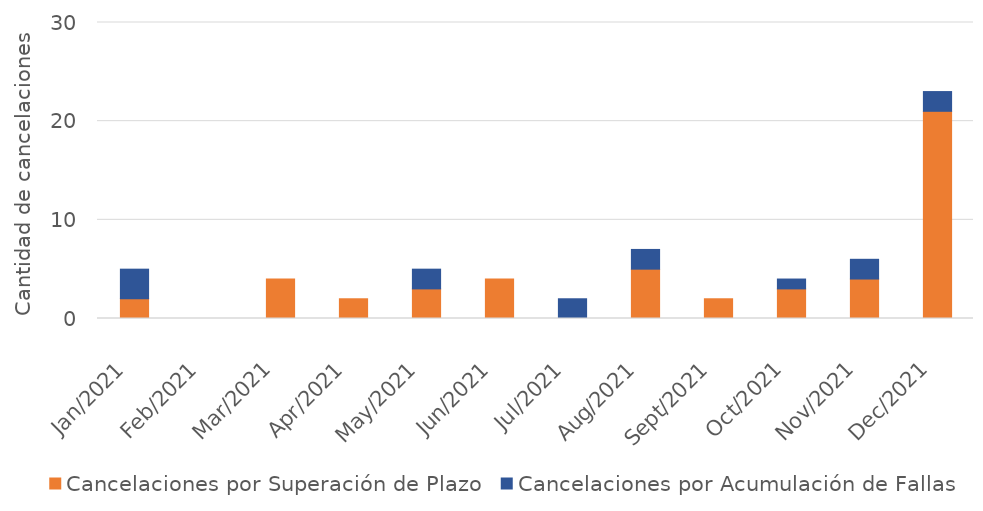
| Category | Cancelaciones por Superación de Plazo | Cancelaciones por Acumulación de Fallas |
|---|---|---|
| 2021-01-01 | 2 | 3 |
| 2021-02-01 | 0 | 0 |
| 2021-03-01 | 4 | 0 |
| 2021-04-01 | 2 | 0 |
| 2021-05-01 | 3 | 2 |
| 2021-06-01 | 4 | 0 |
| 2021-07-01 | 0 | 2 |
| 2021-08-01 | 5 | 2 |
| 2021-09-01 | 2 | 0 |
| 2021-10-01 | 3 | 1 |
| 2021-11-01 | 4 | 2 |
| 2021-12-01 | 21 | 2 |